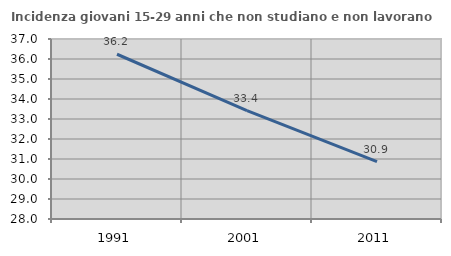
| Category | Incidenza giovani 15-29 anni che non studiano e non lavorano  |
|---|---|
| 1991.0 | 36.238 |
| 2001.0 | 33.416 |
| 2011.0 | 30.871 |